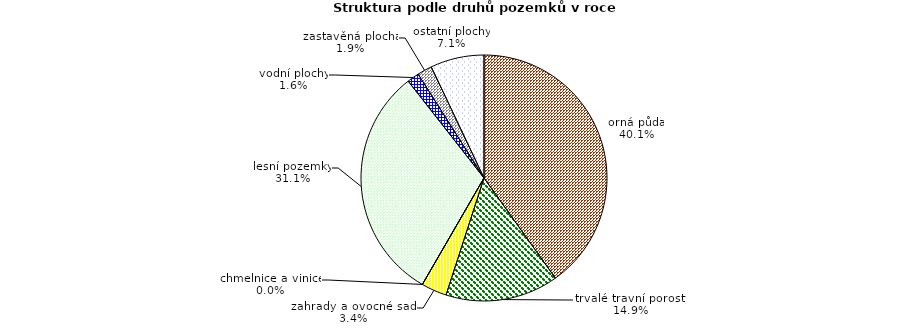
| Category | Struktura druhů pozemků |
|---|---|
| orná půda | 191019.278 |
| trvalé travní porosty | 70675.303 |
| zahrady a ovocné sady | 15993.851 |
| chmelnice a vinice | 1.511 |
| lesní pozemky | 147880.87 |
| vodní plochy | 7485.997 |
| zastavěná plocha | 9260.489 |
| ostatní plochy | 33564.447 |